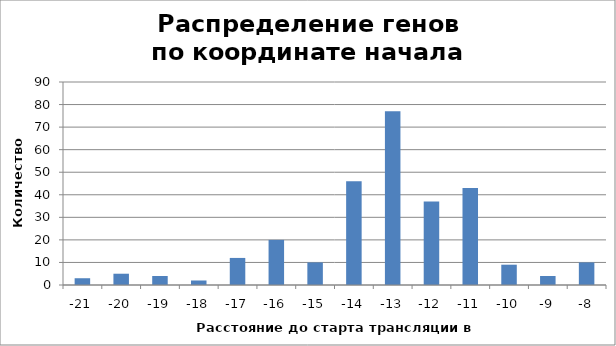
| Category | Итог |
|---|---|
| -21 | 3 |
| -20 | 5 |
| -19 | 4 |
| -18 | 2 |
| -17 | 12 |
| -16 | 20 |
| -15 | 10 |
| -14 | 46 |
| -13 | 77 |
| -12 | 37 |
| -11 | 43 |
| -10 | 9 |
| -9 | 4 |
| -8 | 10 |